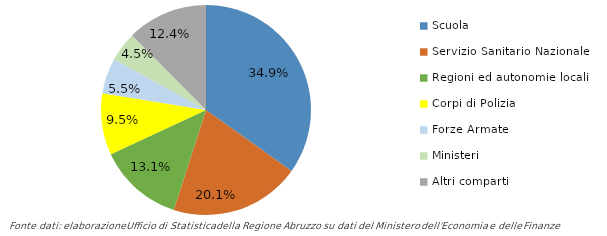
| Category | Series 0 |
|---|---|
| Scuola | 1124307 |
| Servizio Sanitario Nazionale | 648507 |
| Regioni ed autonomie locali | 422093 |
| Corpi di Polizia | 305934 |
| Forze Armate | 176655 |
| Ministeri | 146700 |
| Altri comparti | 400626 |